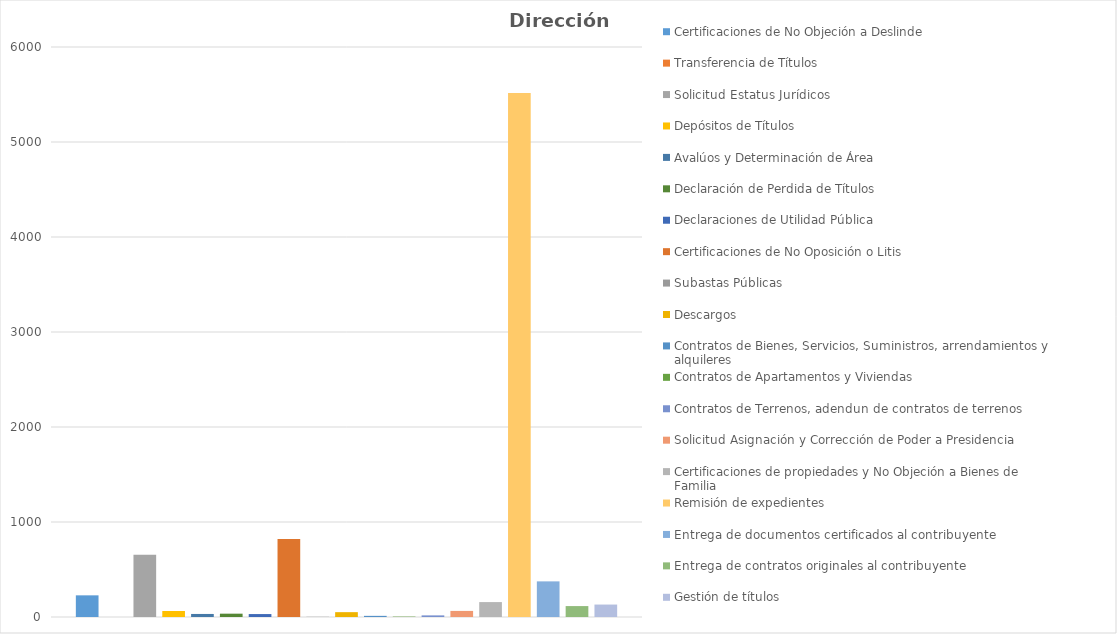
| Category | Certificaciones de No Objeción a Deslinde | Transferencia de Títulos  | Solicitud Estatus Jurídicos  | Depósitos de Títulos  | Avalúos y Determinación de Área | Declaración de Perdida de Títulos  | Declaraciones de Utilidad Pública | Certificaciones de No Oposición o Litis | Subastas Públicas | Descargos  | Contratos de Bienes, Servicios, Suministros, arrendamientos y alquileres | Contratos de Apartamentos y Viviendas  | Contratos de Terrenos, adendun de contratos de terrenos | Solicitud Asignación y Corrección de Poder a Presidencia | Certificaciones de propiedades y No Objeción a Bienes de Familia | Remisión de expedientes | Entrega de documentos certificados al contribuyente | Entrega de contratos originales al contribuyente | Gestión de títulos |
|---|---|---|---|---|---|---|---|---|---|---|---|---|---|---|---|---|---|---|---|
| 0 | 228 | 0 | 654 | 63 | 32 | 35 | 31 | 820 | 2 | 51 | 12 | 4 | 17 | 64 | 157 | 5516 | 375 | 115 | 131 |